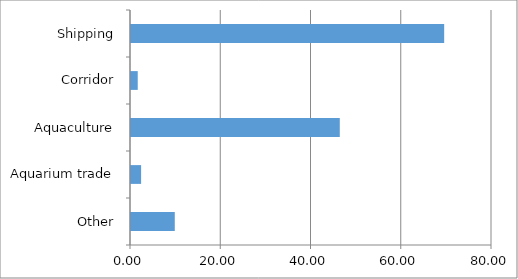
| Category | Series 0 |
|---|---|
| Other | 9.701 |
| Aquarium trade | 2.239 |
| Aquaculture | 46.269 |
| Corridor | 1.493 |
| Shipping | 69.403 |